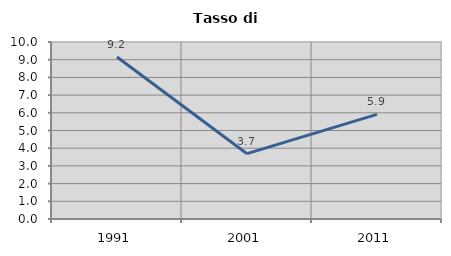
| Category | Tasso di disoccupazione   |
|---|---|
| 1991.0 | 9.153 |
| 2001.0 | 3.69 |
| 2011.0 | 5.914 |